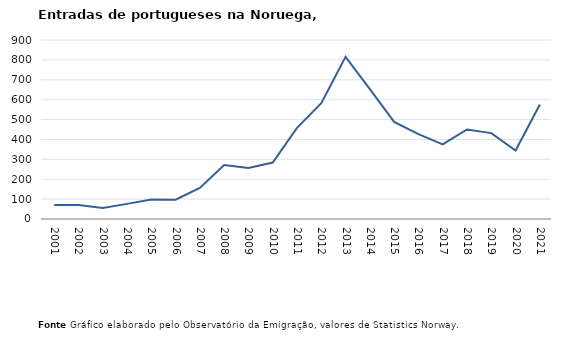
| Category | Entradas |
|---|---|
| 2001.0 | 70 |
| 2002.0 | 70 |
| 2003.0 | 55 |
| 2004.0 | 76 |
| 2005.0 | 98 |
| 2006.0 | 97 |
| 2007.0 | 156 |
| 2008.0 | 271 |
| 2009.0 | 257 |
| 2010.0 | 284 |
| 2011.0 | 458 |
| 2012.0 | 582 |
| 2013.0 | 815 |
| 2014.0 | 653 |
| 2015.0 | 488 |
| 2016.0 | 427 |
| 2017.0 | 375 |
| 2018.0 | 450 |
| 2019.0 | 432 |
| 2020.0 | 344 |
| 2021.0 | 576 |